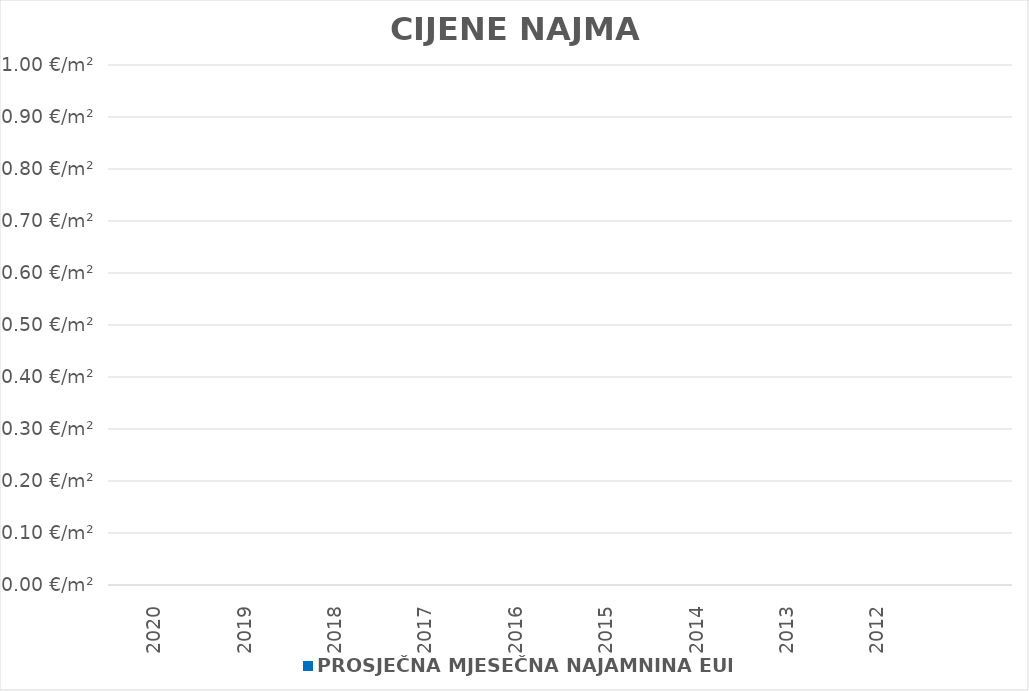
| Category | PROSJEČNA MJESEČNA NAJAMNINA EUR/m² |
|---|---|
| 2020 | 0 |
| 2019 | 0 |
| 2018 | 0 |
| 2017 | 0 |
| 2016 | 0 |
| 2015 | 0 |
| 2014 | 0 |
| 2013 | 0 |
| 2012 | 0 |